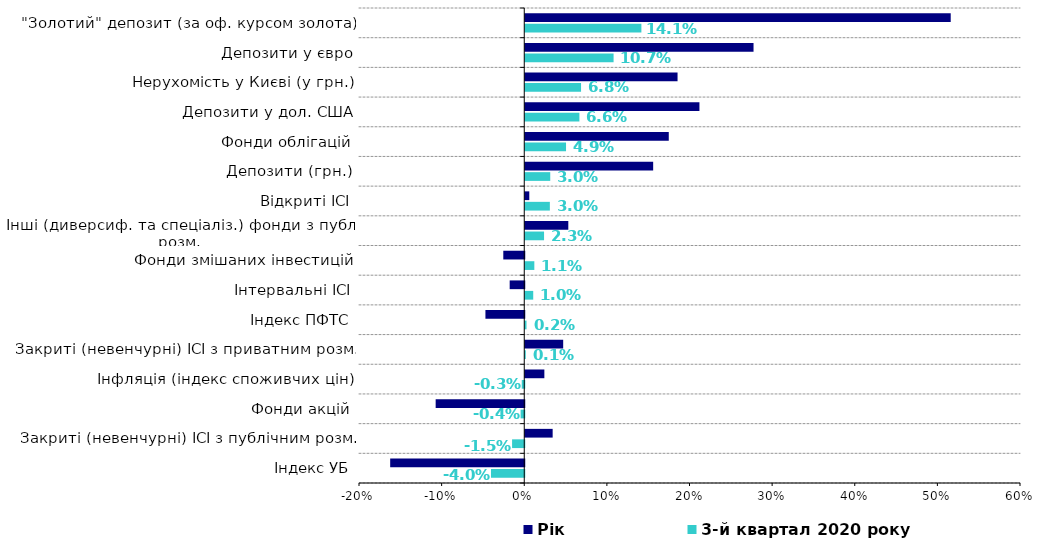
| Category | 3-й квартал 2020 року | Рік |
|---|---|---|
| Індекс УБ | -0.04 | -0.162 |
| Закриті (невенчурні) ІСІ з публічним розм. | -0.015 | 0.033 |
| Фонди акцій | -0.004 | -0.107 |
| Інфляція (індекс споживчих цін) | -0.003 | 0.023 |
| Закриті (невенчурні) ІСІ з приватним розм. | 0.001 | 0.046 |
| Індекс ПФТС | 0.002 | -0.047 |
| Інтервальні ІСІ | 0.01 | -0.018 |
| Фонди змішаних інвестицій | 0.011 | -0.025 |
| Інші (диверсиф. та спеціаліз.) фонди з публ. розм. | 0.023 | 0.052 |
| Відкриті ІСІ | 0.03 | 0.005 |
| Депозити (грн.) | 0.03 | 0.155 |
| Фонди облігацій | 0.049 | 0.174 |
| Депозити у дол. США | 0.066 | 0.211 |
| Нерухомість у Києві (у грн.) | 0.068 | 0.184 |
| Депозити у євро | 0.107 | 0.276 |
| "Золотий" депозит (за оф. курсом золота) | 0.141 | 0.515 |